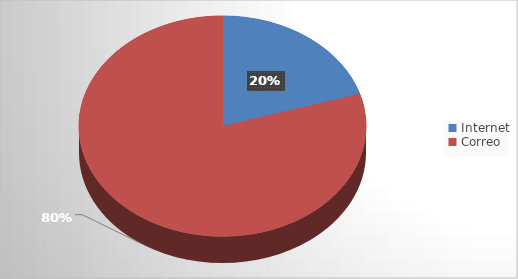
| Category | Series 0 |
|---|---|
| Internet | 17 |
| Correo | 67 |